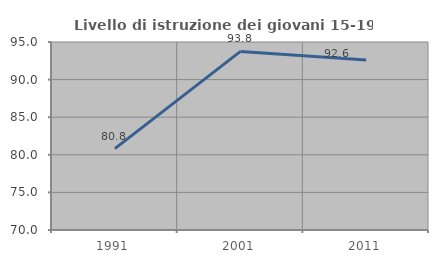
| Category | Livello di istruzione dei giovani 15-19 anni |
|---|---|
| 1991.0 | 80.822 |
| 2001.0 | 93.75 |
| 2011.0 | 92.593 |